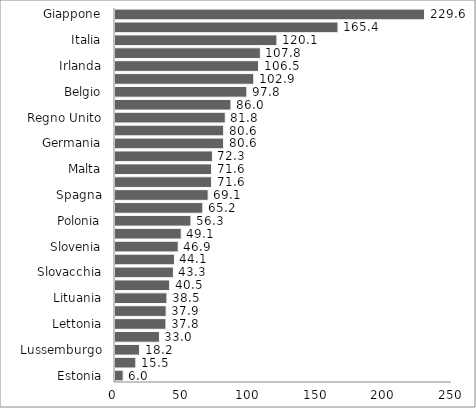
| Category | 2011 |
|---|---|
| Estonia | 6.043 |
| Bulgaria | 15.451 |
| Lussemburgo | 18.182 |
| Romania | 32.953 |
| Lettonia | 37.771 |
| Svezia | 37.918 |
| Lituania | 38.523 |
| Repubblica Ceca | 40.519 |
| Slovacchia | 43.313 |
| Danimarca | 44.093 |
| Slovenia | 46.872 |
| Finlandia | 49.127 |
| Polonia | 56.335 |
| Paesi Bassi | 65.162 |
| Spagna | 69.117 |
| Cyprus | 71.616 |
| Malta | 71.63 |
| Austria | 72.295 |
| Germania | 80.555 |
| Ungheria | 80.599 |
| Regno Unito | 81.792 |
| France | 86.011 |
| Belgio | 97.809 |
| USA | 102.93 |
| Irlanda | 106.46 |
| Portogalllo | 107.818 |
| Italia | 120.102 |
| Grecia | 165.412 |
| Giappone | 229.61 |